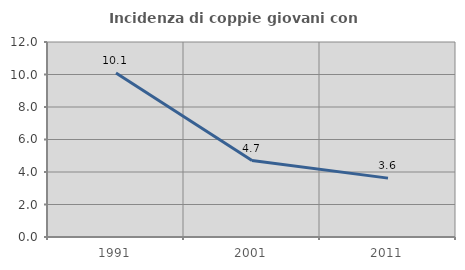
| Category | Incidenza di coppie giovani con figli |
|---|---|
| 1991.0 | 10.096 |
| 2001.0 | 4.706 |
| 2011.0 | 3.623 |